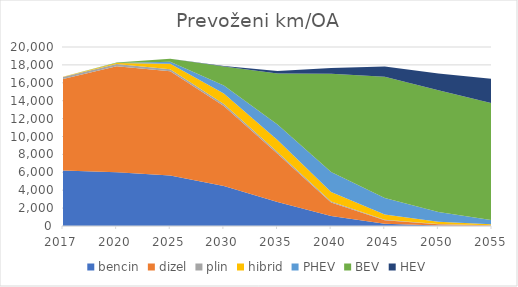
| Category | bencin | dizel | plin | hibrid | PHEV | BEV | HEV |
|---|---|---|---|---|---|---|---|
| 2017 | 6201.282 | 10230.659 | 207.439 | 28.91 | 2.861 | 10.345 | 0 |
| 2020 | 6011.274 | 11849.112 | 228.184 | 119.488 | 17.273 | 47.587 | 0 |
| 2025 | 5647.518 | 11648.077 | 229.553 | 612.759 | 221.455 | 332.642 | 0 |
| 2030 | 4463.949 | 8941.469 | 222.68 | 1174.868 | 891.259 | 2124.279 | 71.404 |
| 2035 | 2684.598 | 5394.962 | 188.409 | 1327.159 | 1735.448 | 5720.126 | 267.916 |
| 2040 | 1115.347 | 1503.033 | 118.866 | 1050.334 | 2246.033 | 10989.199 | 640.151 |
| 2045 | 242.735 | 396.082 | 56.257 | 594.315 | 1827.972 | 13560.424 | 1132.164 |
| 2050 | 65.683 | 131.228 | 24.5 | 263.779 | 1071.467 | 13623.231 | 1871.785 |
| 2055 | 23.183 | 47.639 | 10.445 | 104.24 | 471.215 | 13050.297 | 2744.277 |